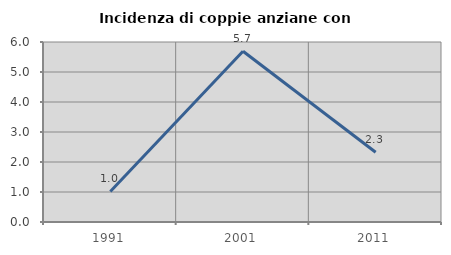
| Category | Incidenza di coppie anziane con figli |
|---|---|
| 1991.0 | 1.017 |
| 2001.0 | 5.691 |
| 2011.0 | 2.326 |